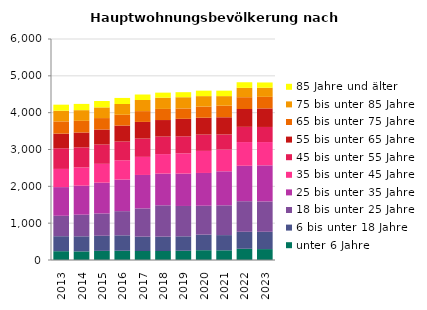
| Category | unter 6 Jahre | 6 bis unter 18 Jahre | 18 bis unter 25 Jahre | 25 bis unter 35 Jahre | 35 bis unter 45 Jahre | 45 bis unter 55 Jahre | 55 bis unter 65 Jahre | 65 bis unter 75 Jahre | 75 bis unter 85 Jahre | 85 Jahre und älter |
|---|---|---|---|---|---|---|---|---|---|---|
| 2013.0 | 239 | 407 | 554 | 779 | 494 | 560 | 398 | 332 | 290 | 164 |
| 2014.0 | 233 | 410 | 587 | 788 | 497 | 542 | 404 | 317 | 290 | 170 |
| 2015.0 | 248 | 410 | 605 | 836 | 512 | 524 | 407 | 311 | 290 | 173 |
| 2016.0 | 251 | 419 | 656 | 857 | 524 | 509 | 434 | 293 | 293 | 164 |
| 2017.0 | 245 | 389 | 767 | 908 | 491 | 497 | 452 | 293 | 302 | 149 |
| 2018.0 | 245 | 389 | 851 | 860 | 530 | 476 | 449 | 302 | 305 | 137 |
| 2019.0 | 251 | 392 | 824 | 878 | 551 | 461 | 476 | 281 | 305 | 137 |
| 2020.0 | 266 | 422 | 785 | 890 | 599 | 443 | 458 | 302 | 284 | 149 |
| 2021.0 | 263 | 413 | 809 | 923 | 590 | 410 | 467 | 314 | 260 | 149 |
| 2022.0 | 305 | 461 | 830 | 962 | 644 | 413 | 485 | 320 | 254 | 152 |
| 2023.0 | 296 | 470 | 824 | 980 | 632 | 410 | 503 | 314 | 248 | 143 |